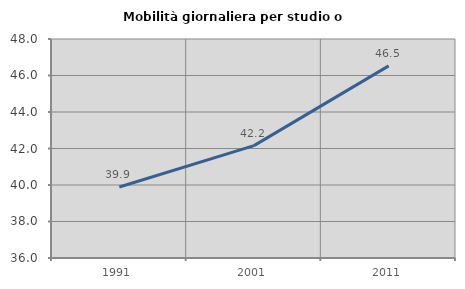
| Category | Mobilità giornaliera per studio o lavoro |
|---|---|
| 1991.0 | 39.889 |
| 2001.0 | 42.156 |
| 2011.0 | 46.528 |